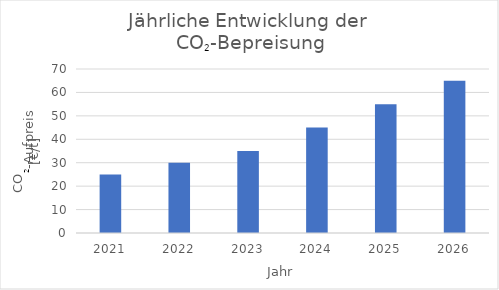
| Category | CO2-Aufpreis |
|---|---|
| 2021.0 | 25 |
| 2022.0 | 30 |
| 2023.0 | 35 |
| 2024.0 | 45 |
| 2025.0 | 55 |
| 2026.0 | 65 |